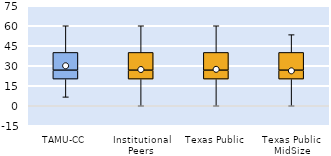
| Category | 25th | 50th | 75th |
|---|---|---|---|
| TAMU-CC | 20 | 6.667 | 13.333 |
| Institutional Peers | 20 | 6.667 | 13.333 |
| Texas Public | 20 | 6.667 | 13.333 |
| Texas Public MidSize | 20 | 6.667 | 13.333 |